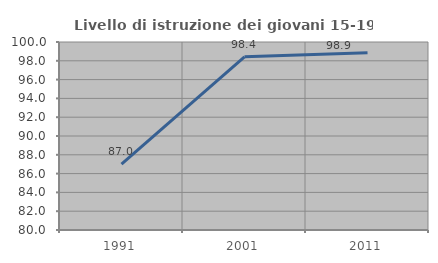
| Category | Livello di istruzione dei giovani 15-19 anni |
|---|---|
| 1991.0 | 87.007 |
| 2001.0 | 98.427 |
| 2011.0 | 98.864 |